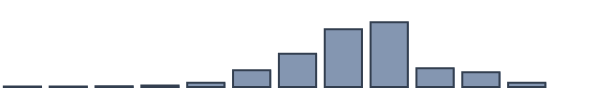
| Category | Series 0 |
|---|---|
| 0 | 0.217 |
| 1 | 0.174 |
| 2 | 0.348 |
| 3 | 0.739 |
| 4 | 1.913 |
| 5 | 7.739 |
| 6 | 15.304 |
| 7 | 26.522 |
| 8 | 29.739 |
| 9 | 8.609 |
| 10 | 6.783 |
| 11 | 1.913 |
| 12 | 0 |